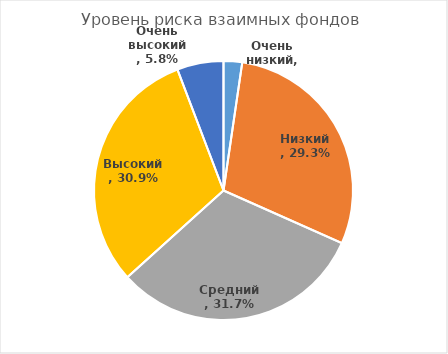
| Category | Процентная доля фондов |
|---|---|
| Очень низкий | 0.023 |
| Низкий | 0.293 |
| Средний | 0.317 |
| Высокий | 0.309 |
| Очень высокий | 0.058 |